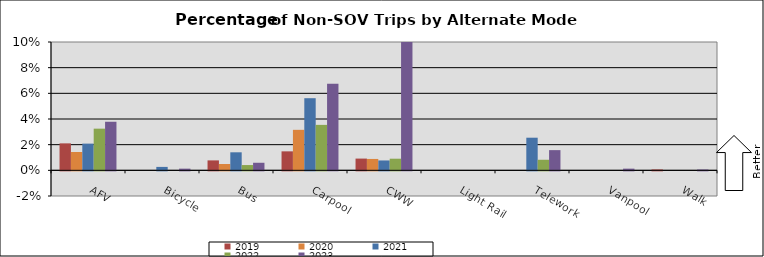
| Category | 2019 | 2020 | 2021 | 2022 | 2023 |
|---|---|---|---|---|---|
| AFV | 0.021 | 0.014 | 0.021 | 0.032 | 0.038 |
| Bicycle | 0 | 0 | 0.003 | 0 | 0.001 |
| Bus | 0.008 | 0.005 | 0.014 | 0.004 | 0.006 |
| Carpool | 0.015 | 0.032 | 0.056 | 0.035 | 0.068 |
| CWW | 0.009 | 0.009 | 0.008 | 0.009 | 0.101 |
| Light Rail | 0 | 0 | 0 | 0 | 0 |
| Telework | 0 | 0 | 0.025 | 0.008 | 0.016 |
| Vanpool | 0 | 0 | 0 | 0 | 0.001 |
| Walk | 0.001 | 0 | 0 | 0 | 0.001 |